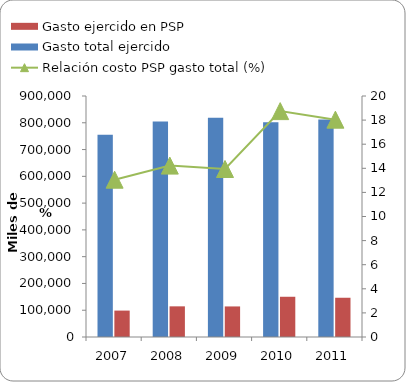
| Category | Gasto total ejercido | Gasto ejercido en PSP |
|---|---|---|
| 2007 | 755421 | 98620 |
| 2008 | 804875 | 114484 |
| 2009 | 818576 | 114129 |
| 2010 | 801583 | 150259 |
| 2011 | 812630 | 146567 |